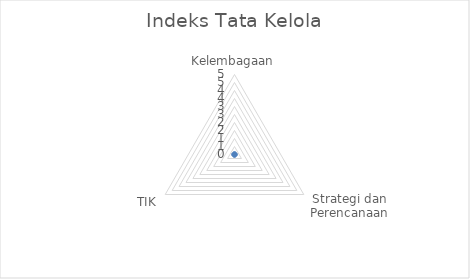
| Category | Indeks |
|---|---|
| Kelembagaan | 0 |
| Strategi dan Perencanaan | 0 |
| TIK | 0 |